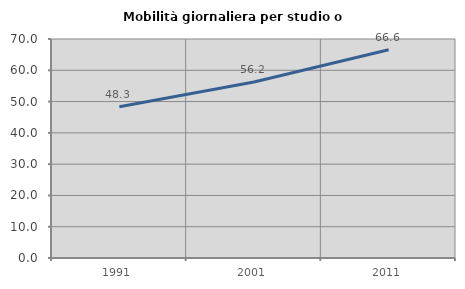
| Category | Mobilità giornaliera per studio o lavoro |
|---|---|
| 1991.0 | 48.348 |
| 2001.0 | 56.246 |
| 2011.0 | 66.558 |